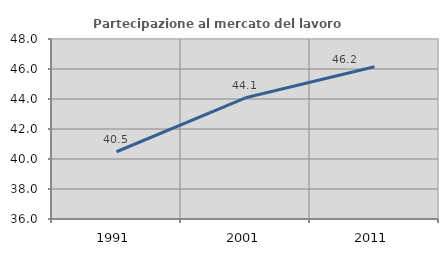
| Category | Partecipazione al mercato del lavoro  femminile |
|---|---|
| 1991.0 | 40.483 |
| 2001.0 | 44.081 |
| 2011.0 | 46.155 |